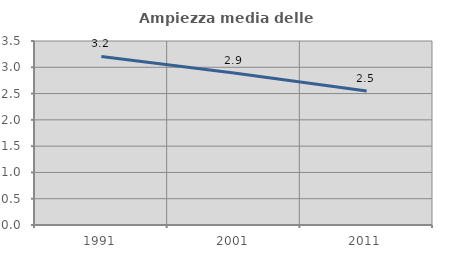
| Category | Ampiezza media delle famiglie |
|---|---|
| 1991.0 | 3.206 |
| 2001.0 | 2.89 |
| 2011.0 | 2.547 |